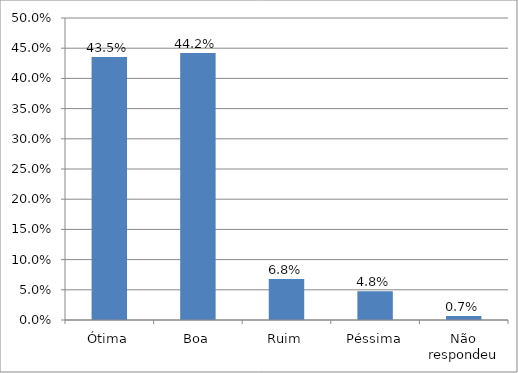
| Category | Series 0 |
|---|---|
| Ótima | 0.435 |
| Boa | 0.442 |
| Ruim | 0.068 |
| Péssima | 0.048 |
| Não respondeu | 0.007 |